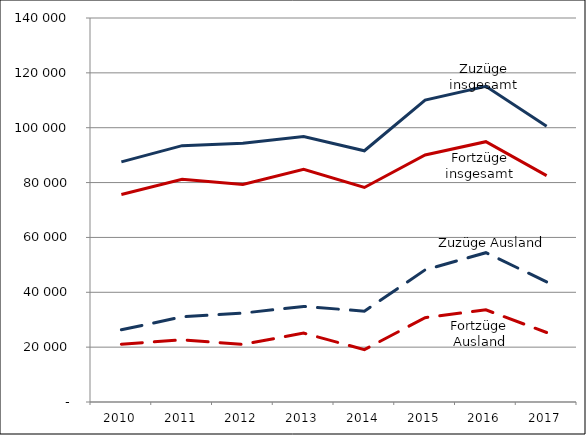
| Category | Zuzüge insgesamt | Zuzüge Ausland | Fortzüge insgesamt | Fortzüge Ausland |
|---|---|---|---|---|
| 2010.0 | 87538 | 26324 | 75668 | 21078 |
| 2011.0 | 93466 | 31048 | 81231 | 22674 |
| 2012.0 | 94346 | 32412 | 79335 | 20979 |
| 2013.0 | 96782 | 34839 | 84823 | 25125 |
| 2014.0 | 91594 | 33131 | 78218 | 19091 |
| 2015.0 | 110070 | 48173 | 90072 | 30757 |
| 2016.0 | 115115 | 54438 | 94914 | 33587 |
| 2017.0 | 100534 | 43809 | 82525 | 25341 |